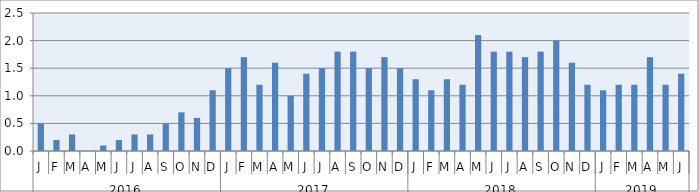
| Category | Series 0 |
|---|---|
| 0 | 0.5 |
| 1 | 0.2 |
| 2 | 0.3 |
| 3 | 0 |
| 4 | 0.1 |
| 5 | 0.2 |
| 6 | 0.3 |
| 7 | 0.3 |
| 8 | 0.5 |
| 9 | 0.7 |
| 10 | 0.6 |
| 11 | 1.1 |
| 12 | 1.5 |
| 13 | 1.7 |
| 14 | 1.2 |
| 15 | 1.6 |
| 16 | 1 |
| 17 | 1.4 |
| 18 | 1.5 |
| 19 | 1.8 |
| 20 | 1.8 |
| 21 | 1.5 |
| 22 | 1.7 |
| 23 | 1.5 |
| 24 | 1.3 |
| 25 | 1.1 |
| 26 | 1.3 |
| 27 | 1.2 |
| 28 | 2.1 |
| 29 | 1.8 |
| 30 | 1.8 |
| 31 | 1.7 |
| 32 | 1.8 |
| 33 | 2 |
| 34 | 1.6 |
| 35 | 1.2 |
| 36 | 1.1 |
| 37 | 1.2 |
| 38 | 1.2 |
| 39 | 1.7 |
| 40 | 1.2 |
| 41 | 1.4 |